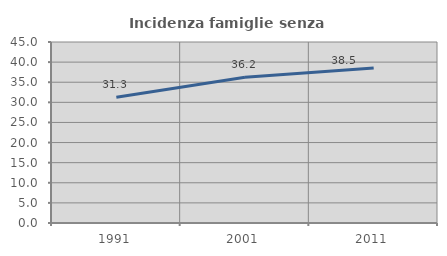
| Category | Incidenza famiglie senza nuclei |
|---|---|
| 1991.0 | 31.25 |
| 2001.0 | 36.234 |
| 2011.0 | 38.537 |